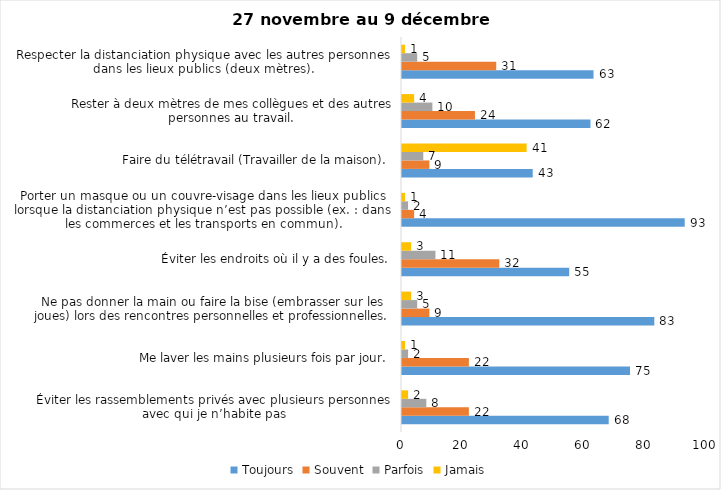
| Category | Toujours | Souvent | Parfois | Jamais |
|---|---|---|---|---|
| Éviter les rassemblements privés avec plusieurs personnes avec qui je n’habite pas | 68 | 22 | 8 | 2 |
| Me laver les mains plusieurs fois par jour. | 75 | 22 | 2 | 1 |
| Ne pas donner la main ou faire la bise (embrasser sur les joues) lors des rencontres personnelles et professionnelles. | 83 | 9 | 5 | 3 |
| Éviter les endroits où il y a des foules. | 55 | 32 | 11 | 3 |
| Porter un masque ou un couvre-visage dans les lieux publics lorsque la distanciation physique n’est pas possible (ex. : dans les commerces et les transports en commun). | 93 | 4 | 2 | 1 |
| Faire du télétravail (Travailler de la maison). | 43 | 9 | 7 | 41 |
| Rester à deux mètres de mes collègues et des autres personnes au travail. | 62 | 24 | 10 | 4 |
| Respecter la distanciation physique avec les autres personnes dans les lieux publics (deux mètres). | 63 | 31 | 5 | 1 |